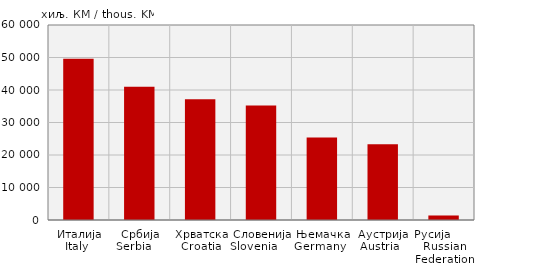
| Category | Извоз
Export |
|---|---|
| Италија
Italy  | 49648 |
| Србија
Serbia     | 41002 |
| Хрватска
Croatia | 37190 |
| Словенија
Slovenia            | 35199 |
| Њемачка
Germany   | 25350 |
| Аустрија
Austria   | 23326 |
| Русија        Russian Federation | 1389 |